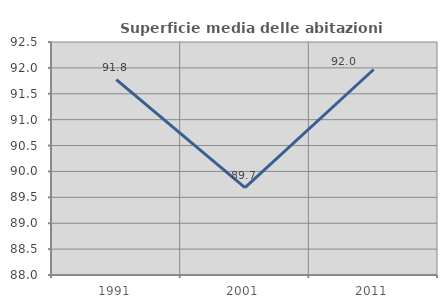
| Category | Superficie media delle abitazioni occupate |
|---|---|
| 1991.0 | 91.773 |
| 2001.0 | 89.688 |
| 2011.0 | 91.969 |